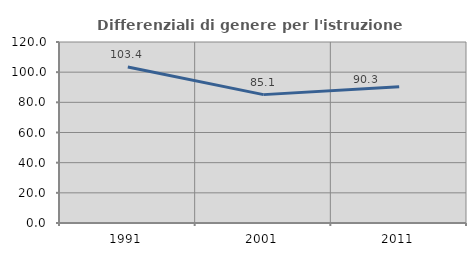
| Category | Differenziali di genere per l'istruzione superiore |
|---|---|
| 1991.0 | 103.368 |
| 2001.0 | 85.111 |
| 2011.0 | 90.281 |